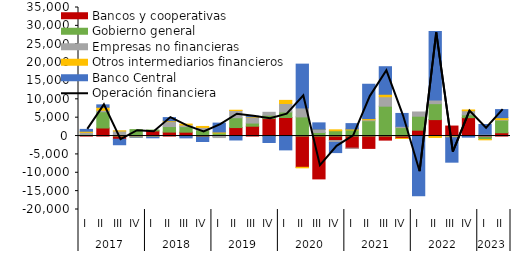
| Category | Bancos y cooperativas | Gobierno general | Empresas no financieras | Otros intermediarios financieros | Banco Central |
|---|---|---|---|---|---|
| 0 | 176.525 | 291.94 | 552.774 | 291.309 | 500.031 |
| 1 | 2191.03 | 4434.382 | 396.373 | 816.648 | 657.32 |
| 2 | -866.634 | 335.819 | 1034.76 | 24.218 | -1500.259 |
| 3 | 269.332 | 1484.954 | -199.227 | -72.585 | -26.614 |
| 4 | 1397.801 | 235.632 | -83.56 | -138.035 | -252.82 |
| 5 | 1077.762 | 1504.673 | 1356.124 | 214.215 | 872.22 |
| 6 | 1052.846 | 1509.857 | 448.531 | 245.563 | -495.87 |
| 7 | -306.499 | 1625.849 | 723.919 | 266.304 | -1185.782 |
| 8 | -21.106 | 828.073 | -393.541 | 266.297 | 2429.827 |
| 9 | 2308.815 | 2686.164 | 1961.172 | 72.613 | -1071.366 |
| 10 | 2677.373 | 853.875 | 1582.22 | 145.283 | 142.172 |
| 11 | 4750.727 | 906.93 | 808.038 | -131.251 | -1619.017 |
| 12 | 5043.509 | 1503.307 | 2309.269 | 854.352 | -3766.184 |
| 13 | -8509.202 | 5214.739 | 2437.834 | -146.454 | 11929.007 |
| 14 | -11666.258 | 962.307 | 874.227 | 21.263 | 1729.234 |
| 15 | -1230.751 | 1438.424 | -514.103 | 253.284 | -2759.208 |
| 16 | -3304.253 | 1670.011 | -20.372 | 261.36 | 1455.217 |
| 17 | -3361.381 | 4160.799 | 260.763 | 329.189 | 9354.292 |
| 18 | -1109.253 | 8132.548 | 2574.451 | 671.208 | 7500.376 |
| 19 | -639.184 | 2294.791 | 350.223 | -10.439 | 3508.969 |
| 20 | 1593.5 | 3814.868 | 1140.6 | -89.462 | -16162.137 |
| 21 | 4476.203 | 4344.794 | 984.301 | -380.579 | 18652.618 |
| 22 | 2721.849 | -170.501 | -143.069 | -124.108 | -6677.199 |
| 23 | 5005.331 | 765.426 | 1125.931 | 208.079 | -298.343 |
| 24 | -338.16 | -606.756 | 498.756 | -83.832 | 2650.399 |
| 25 | 891.006 | 3431.673 | 136.783 | 549.299 | 2195.225 |